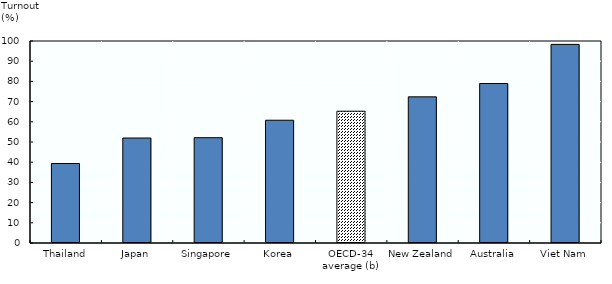
| Category | Series 1 |
|---|---|
| Thailand | 39.35 |
| Japan | 51.97 |
| Singapore | 52.13 |
| Korea | 60.78 |
| OECD-34 average (b) | 65.235 |
| New Zealand | 72.35 |
| Australia | 78.96 |
| Viet Nam | 98.32 |